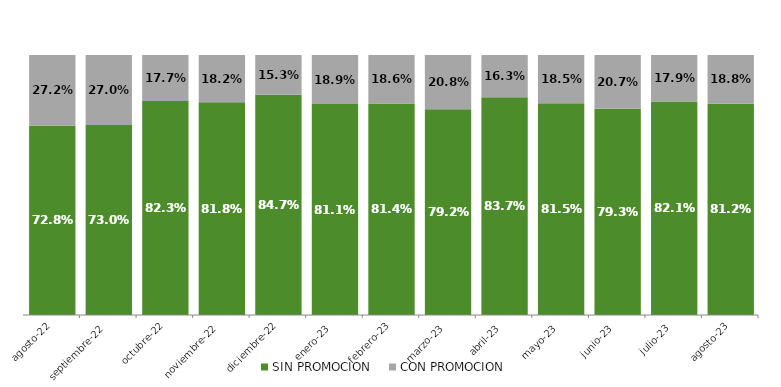
| Category | SIN PROMOCION   | CON PROMOCION   |
|---|---|---|
| 2022-08-01 | 0.728 | 0.272 |
| 2022-09-01 | 0.73 | 0.27 |
| 2022-10-01 | 0.823 | 0.177 |
| 2022-11-01 | 0.818 | 0.182 |
| 2022-12-01 | 0.847 | 0.153 |
| 2023-01-01 | 0.811 | 0.189 |
| 2023-02-01 | 0.814 | 0.186 |
| 2023-03-01 | 0.792 | 0.208 |
| 2023-04-01 | 0.837 | 0.163 |
| 2023-05-01 | 0.815 | 0.185 |
| 2023-06-01 | 0.793 | 0.207 |
| 2023-07-01 | 0.821 | 0.179 |
| 2023-08-01 | 0.812 | 0.188 |